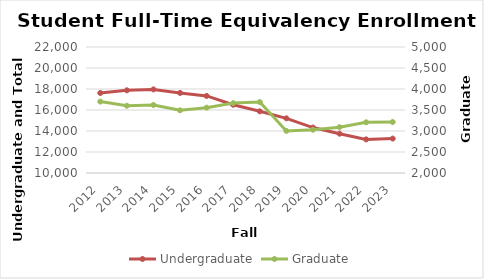
| Category | Undergraduate |
|---|---|
| 2012.0 | 17620 |
| 2013.0 | 17876 |
| 2014.0 | 17961.4 |
| 2015.0 | 17627 |
| 2016.0 | 17342 |
| 2017.0 | 16500 |
| 2018.0 | 15874 |
| 2019.0 | 15207 |
| 2020.0 | 14329 |
| 2021.0 | 13743.554 |
| 2022.0 | 13202.07 |
| 2023.0 | 13280.11 |